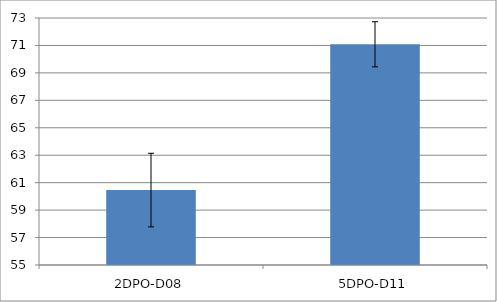
| Category | Series 0 |
|---|---|
| 2DPO-D08 | 60.46 |
| 5DPO-D11 | 71.085 |